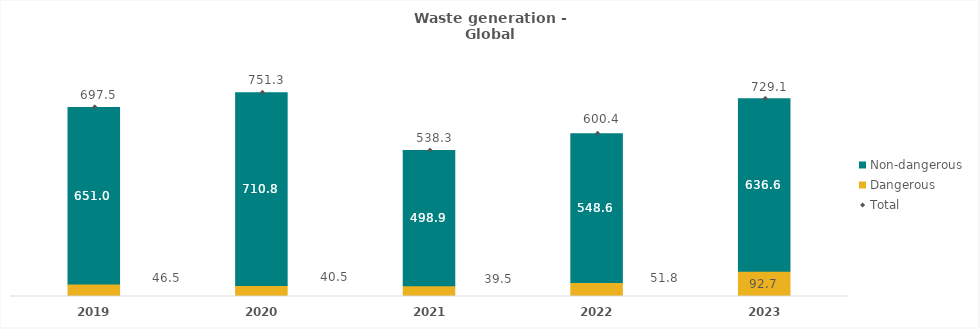
| Category | Dangerous | Non-dangerous |
|---|---|---|
| 2019.0 | 46.545 | 650.989 |
| 2020.0 | 40.475 | 710.802 |
| 2021.0 | 39.451 | 498.871 |
| 2022.0 | 51.79 | 548.64 |
| 2023.0 | 92.738 | 636.6 |